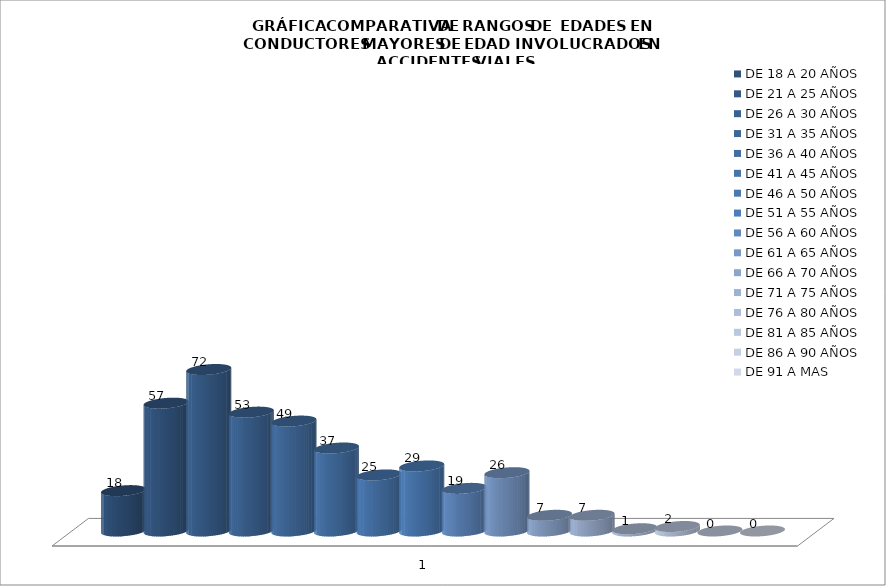
| Category | DE 18 A 20 AÑOS | DE 21 A 25 AÑOS | DE 26 A 30 AÑOS | DE 31 A 35 AÑOS | DE 36 A 40 AÑOS | DE 41 A 45 AÑOS | DE 46 A 50 AÑOS | DE 51 A 55 AÑOS | DE 56 A 60 AÑOS | DE 61 A 65 AÑOS | DE 66 A 70 AÑOS | DE 71 A 75 AÑOS | DE 76 A 80 AÑOS | DE 81 A 85 AÑOS | DE 86 A 90 AÑOS | DE 91 A MAS |
|---|---|---|---|---|---|---|---|---|---|---|---|---|---|---|---|---|
| 0 | 18 | 57 | 72 | 53 | 49 | 37 | 25 | 29 | 19 | 26 | 7 | 7 | 1 | 2 | 0 | 0 |